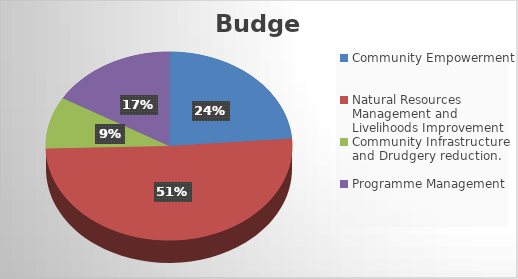
| Category | Budget |
|---|---|
| Community Empowerment | 234065894 |
| Natural Resources Management and Livelihoods Improvement | 501774038.928 |
| Community Infrastructure and Drudgery reduction. | 87684600 |
| Programme Management | 163088531 |